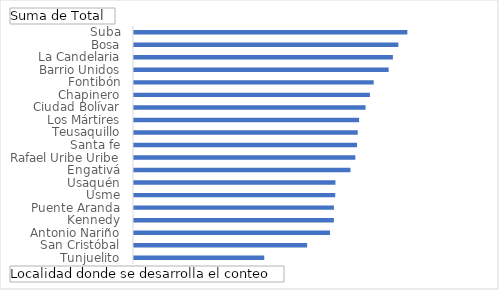
| Category | Total |
|---|---|
| Tunjuelito | 7318 |
| San Cristóbal | 9727 |
| Antonio Nariño | 11011 |
| Kennedy | 11228 |
| Puente Aranda | 11233 |
| Usme | 11306 |
| Usaquén | 11316 |
| Engativá | 12163 |
| Rafael Uribe Uribe | 12436 |
| Santa fe | 12529 |
| Teusaquillo | 12569 |
| Los Mártires | 12645 |
| Ciudad Bolívar | 13010 |
| Chapinero | 13253 |
| Fontibón | 13466 |
| Barrio Unidos | 14306 |
| La Candelaria | 14545 |
| Bosa | 14850 |
| Suba | 15357 |